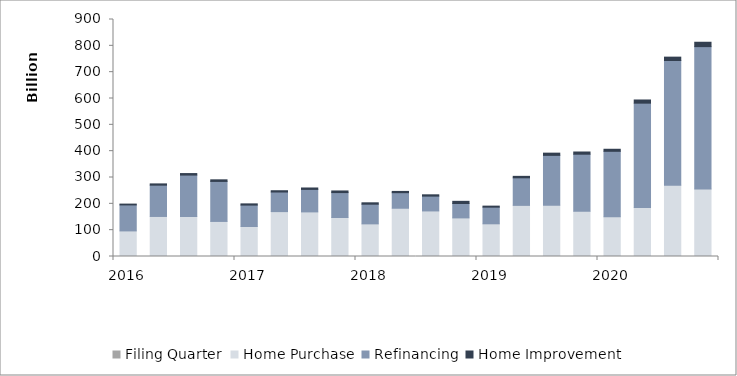
| Category | Filing Quarter | Home Purchase | Refinancing | Home Improvement |
|---|---|---|---|---|
| 2016 | 0 | 97161975641 | 98655367987 | 3206360454 |
| 2016 | 0 | 152048606800 | 118811037286 | 4855337842 |
| 2016 | 0 | 151988519149 | 157179533419 | 5769539506 |
| 2016 | 0 | 133187588388 | 151934080835 | 6064483118 |
| 2017 | 0 | 113829634250 | 81359069638 | 4651062407 |
| 2017 | 0 | 170444454197 | 74433630979 | 4887766339 |
| 2017 | 0 | 169392462027 | 85416781862 | 5370310177 |
| 2017 | 0 | 148104038533 | 94622483848 | 6168449784 |
| 2018 | 0 | 123918265027 | 74690371787 | 5301523310 |
| 2018 | 0 | 183305206616 | 59053391038 | 4783614107 |
| 2018 | 0 | 173035680065 | 56269972282 | 4971421243 |
| 2018 | 0 | 146582947480 | 54748609396 | 8157899656 |
| 2019 | 0 | 124167950342 | 63182176214 | 3940300862 |
| 2019 | 0 | 194161036181 | 104670880193 | 5527737921 |
| 2019 | 0 | 194625707210 | 189421081625 | 8447465305 |
| 2019 | 0 | 171541593571 | 216890221693 | 8411918780 |
| 2020 | 0 | 150906987883 | 248552294892 | 7758954039 |
| 2020 | 0 | 185832077240 | 396474761001 | 12052039292 |
| 2020 | 0 | 270899897427 | 473315248161 | 12864893684 |
| 2020 | 0 | 256687245207 | 540299396671 | 16636542939 |